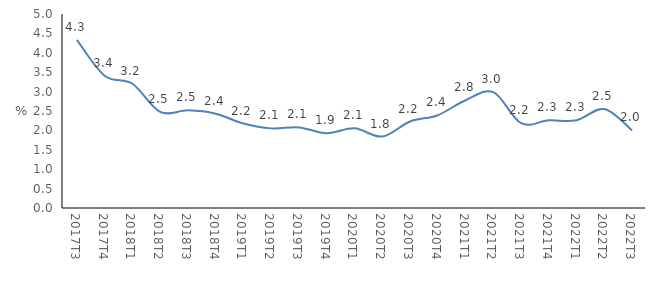
| Category | 2017Τ3 |
|---|---|
| 2017Τ3 | 4.333 |
| 2017Τ4 | 3.409 |
| 2018Τ1 | 3.202 |
| 2018Τ2 | 2.477 |
| 2018Τ3 | 2.517 |
| 2018Τ4 | 2.43 |
| 2019Τ1 | 2.177 |
| 2019Τ2 | 2.052 |
| 2019Τ3 | 2.078 |
| 2019Τ4 | 1.927 |
| 2020Τ1 | 2.052 |
| 2020Τ2 | 1.842 |
| 2020Τ3 | 2.229 |
| 2020Τ4 | 2.392 |
| 2021Τ1 | 2.778 |
| 2021Τ2 | 2.985 |
| 2021Τ3 | 2.185 |
| 2021Τ4 | 2.259 |
| 2022Τ1 | 2.263 |
| 2022Τ2 | 2.55 |
| 2022Τ3 | 2 |